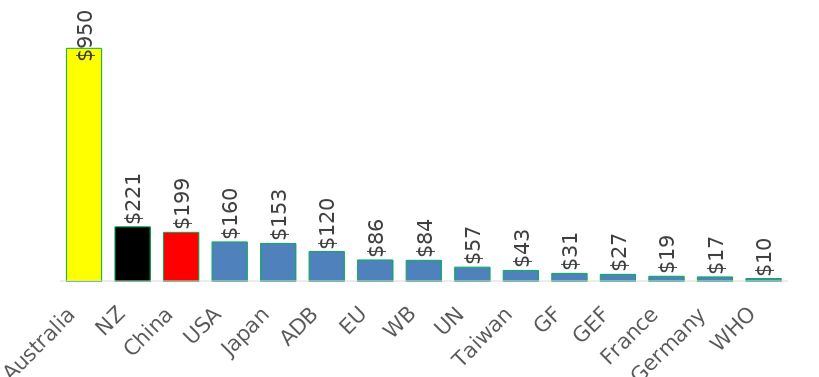
| Category | Average 2012-17 (US) |
|---|---|
| Australia | 949.694 |
| NZ | 221.064 |
| China | 198.645 |
| USA | 159.581 |
| Japan | 153.215 |
| ADB | 120.314 |
| EU | 85.96 |
| WB | 84.392 |
| UN | 56.575 |
| Taiwan | 43.246 |
| GF | 31.18 |
| GEF | 27.193 |
| France | 19.2 |
| Germany | 16.778 |
| WHO | 10.058 |